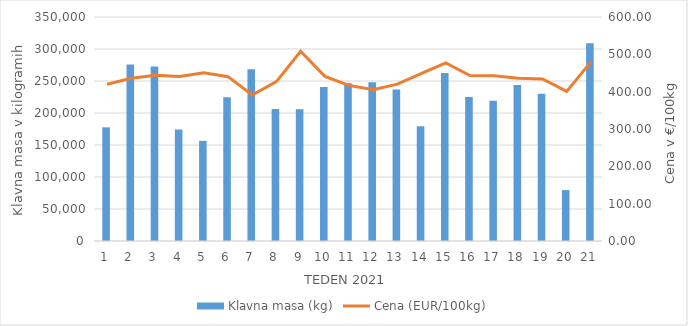
| Category | Klavna masa (kg) |
|---|---|
| 1.0 | 177573 |
| 2.0 | 275951 |
| 3.0 | 272797 |
| 4.0 | 174056 |
| 5.0 | 156508 |
| 6.0 | 224595 |
| 7.0 | 268436 |
| 8.0 | 206193 |
| 9.0 | 205669 |
| 10.0 | 240592 |
| 11.0 | 246325 |
| 12.0 | 248020 |
| 13.0 | 236703 |
| 14.0 | 179478 |
| 15.0 | 262544 |
| 16.0 | 225033 |
| 17.0 | 218950 |
| 18.0 | 243711 |
| 19.0 | 229955 |
| 20.0 | 79521 |
| 21.0 | 309134 |